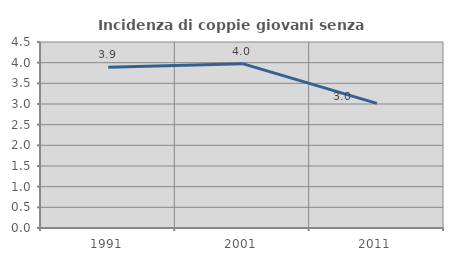
| Category | Incidenza di coppie giovani senza figli |
|---|---|
| 1991.0 | 3.887 |
| 2001.0 | 3.977 |
| 2011.0 | 3.016 |